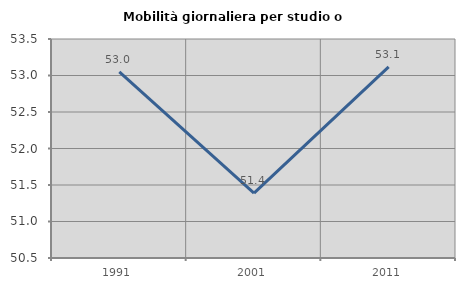
| Category | Mobilità giornaliera per studio o lavoro |
|---|---|
| 1991.0 | 53.049 |
| 2001.0 | 51.388 |
| 2011.0 | 53.117 |